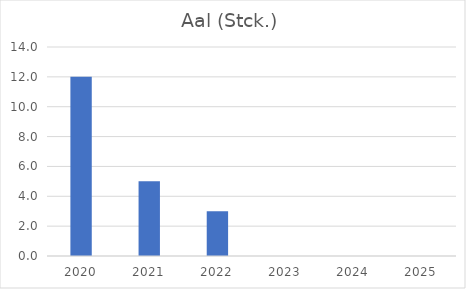
| Category | Aal: Fang (Stck.) |
|---|---|
| 2020.0 | 12 |
| 2021.0 | 5 |
| 2022.0 | 3 |
| 2023.0 | 0 |
| 2024.0 | 0 |
| 2025.0 | 0 |